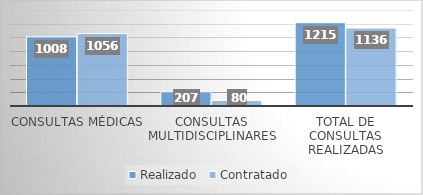
| Category | Realizado | Contratado |
|---|---|---|
| Consultas Médicas | 1008 | 1056 |
| Consultas Multidisciplinares | 207 | 80 |
| Total de Consultas Realizadas | 1215 | 1136 |